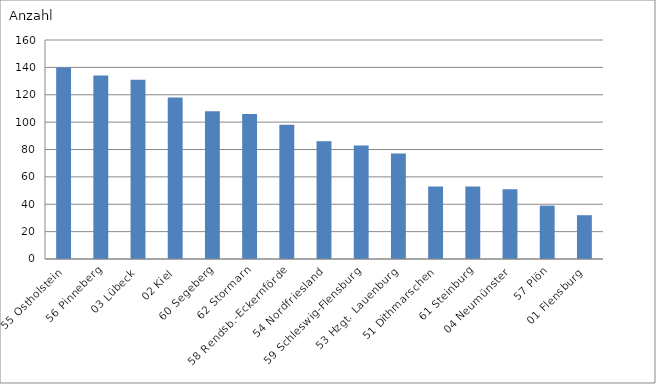
| Category | 55 Ostholstein |
|---|---|
| 55 Ostholstein | 140 |
| 56 Pinneberg | 134 |
| 03 Lübeck | 131 |
| 02 Kiel | 118 |
| 60 Segeberg | 108 |
| 62 Stormarn | 106 |
| 58 Rendsb.-Eckernförde | 98 |
| 54 Nordfriesland | 86 |
| 59 Schleswig-Flensburg | 83 |
| 53 Hzgt. Lauenburg | 77 |
| 51 Dithmarschen | 53 |
| 61 Steinburg | 53 |
| 04 Neumünster | 51 |
| 57 Plön | 39 |
| 01 Flensburg | 32 |